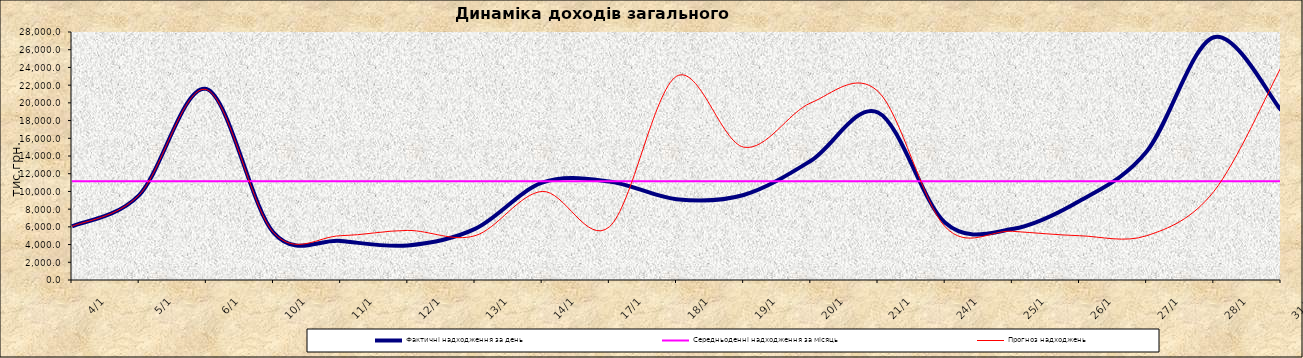
| Category | Фактичні надходження за день | Середньоденні надходження за місяць | Прогноз надходжень |
|---|---|---|---|
| 2021-01-04 | 6058.776 | 11163.016 | 6050 |
| 2021-01-05 | 9586.552 | 11163 | 9600 |
| 2021-01-06 | 21571.006 | 11163 | 21500 |
| 2021-01-10 | 5347.42 | 11163 | 5350 |
| 2021-01-11 | 4412.508 | 11163 | 5000 |
| 2021-01-12 | 3905.262 | 11163 | 5600 |
| 2021-01-13 | 5770.988 | 11163 | 5000 |
| 2021-01-14 | 10990.77 | 11163 | 10000 |
| 2021-01-17 | 11127.3 | 11163 | 6000 |
| 2021-01-18 | 9126.5 | 11163 | 23000 |
| 2021-01-19 | 9599.93 | 11163 | 15000 |
| 2021-01-20 | 13459.5 | 11163 | 20000 |
| 2021-01-21 | 18907.3 | 11163 | 21300 |
| 2021-01-24 | 6467.9 | 11163 | 6000 |
| 2021-01-25 | 5751.2 | 11163 | 5500 |
| 2021-01-26 | 8917 | 11163 | 5000 |
| 2021-01-27 | 14506.1 | 11163 | 5000 |
| 2021-01-28 | 27409.1 | 11163 | 10000 |
| 2021-01-31 | 19182.2 | 11163 | 24000 |